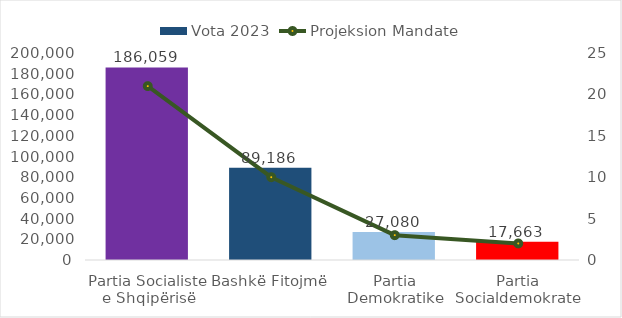
| Category | Vota 2023 |
|---|---|
| Partia Socialiste e Shqipërisë | 186059 |
| Bashkë Fitojmë | 89186 |
| Partia Demokratike | 27080 |
| Partia Socialdemokrate | 17663 |